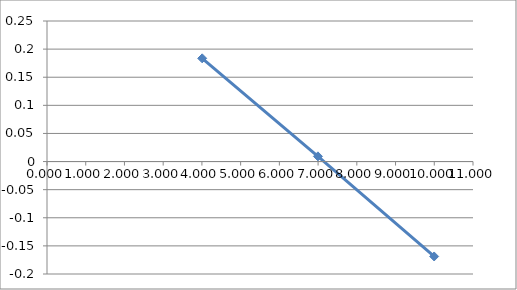
| Category | Series 0 |
|---|---|
| 9.997 | -0.169 |
| 6.996 | 0.009 |
| 4.007 | 0.184 |